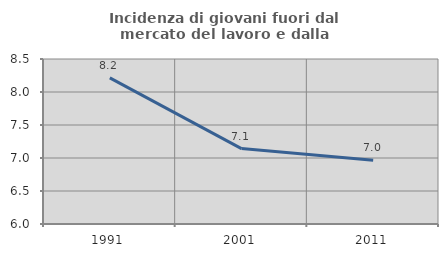
| Category | Incidenza di giovani fuori dal mercato del lavoro e dalla formazione  |
|---|---|
| 1991.0 | 8.214 |
| 2001.0 | 7.143 |
| 2011.0 | 6.967 |